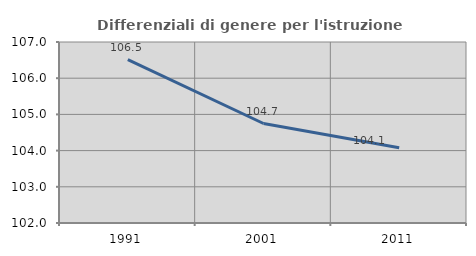
| Category | Differenziali di genere per l'istruzione superiore |
|---|---|
| 1991.0 | 106.513 |
| 2001.0 | 104.749 |
| 2011.0 | 104.078 |